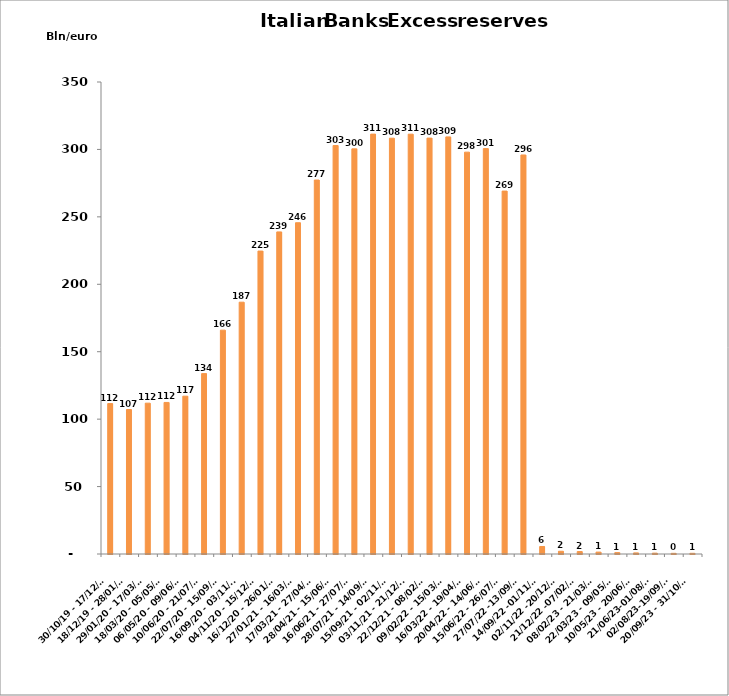
| Category | Series 0 |
|---|---|
| 30/10/19 - 17/12/19 | 111519 |
| 18/12/19 - 28/01/20 | 107096 |
| 29/01/20 - 17/03/20 | 111849 |
| 18/03/20 - 05/05/20 | 112383 |
| 06/05/20 - 09/06/20 | 117015 |
| 10/06/20 - 21/07/20 | 133761 |
| 22/07/20 - 15/09/20 | 165985 |
| 16/09/20 - 03/11/20 | 186720 |
| 04/11/20 - 15/12/20 | 224630 |
| 16/12/20 - 26/01/21 | 238830 |
| 27/01/21 - 16/03/21 | 245650 |
| 17/03/21 - 27/04/21 | 277315 |
| 28/04/21 - 15/06/21 | 302889 |
| 16/06/21 - 27/07/21 | 300413 |
| 28/07/21 - 14/09/21 | 311358 |
| 15/09/21 - 02/11/21 | 308319 |
| 03/11/21 - 21/12/21 | 311303 |
| 22/12/21 - 08/02/22 | 308385 |
| 09/02/22 - 15/03/22 | 309294 |
| 16/03/22 - 19/04/22 | 297987 |
| 20/04/22 - 14/06/22 | 300604 |
| 15/06/22 - 26/07/22 | 269112 |
| 27/07/22 -13/09/22 | 295881 |
| 14/09/22 -01/11/22 | 5567 |
| 02/11/22 -20/12/22 | 2033 |
| 21/12/22 -07/02/23 | 1817 |
| 08/02/23 - 21/03/23 | 1406 |
| 22/03/23 - 09/05/23 | 1015 |
| 10/05/23 - 20/06/23 | 817 |
| 21/06/23-01/08/23 | 646 |
| 02/08/23-19/09/23 | 498 |
| 20/09/23 - 31/10/23 | 510 |